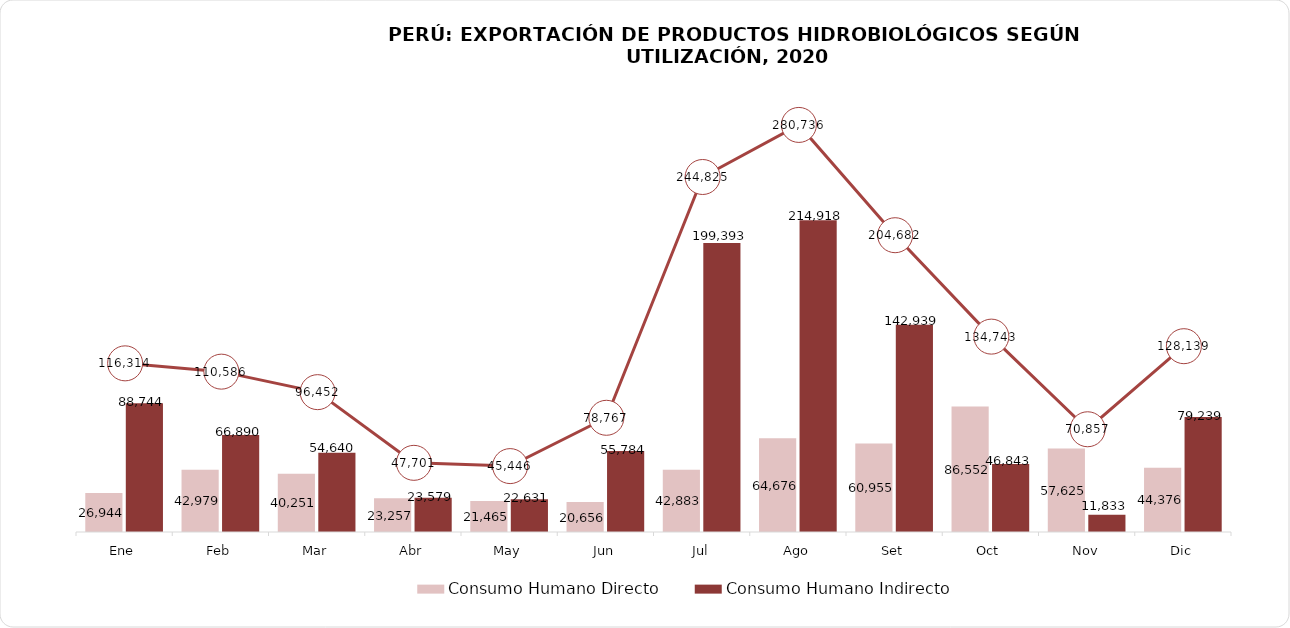
| Category | Consumo Humano Directo | Consumo Humano Indirecto |
|---|---|---|
| Ene | 26944.142 | 88743.704 |
| Feb | 42979.312 | 66890.422 |
| Mar | 40251.031 | 54640.197 |
| Abr | 23257.272 | 23578.9 |
| May | 21464.782 | 22630.591 |
| Jun | 20655.878 | 55783.602 |
| Jul | 42883.438 | 199393.147 |
| Ago | 64675.819 | 214917.997 |
| Set | 60955.435 | 142939.203 |
| Oct | 86551.678 | 46843.364 |
| Nov | 57624.627 | 11833.248 |
| Dic | 44375.841 | 79239.13 |